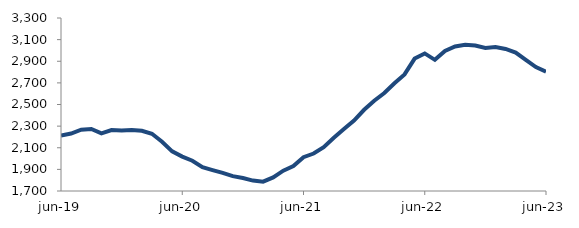
| Category | Series 0 |
|---|---|
| 2019-06-01 | 2213.708 |
| 2019-07-01 | 2231.834 |
| 2019-08-01 | 2267.321 |
| 2019-09-01 | 2273.768 |
| 2019-10-01 | 2233.304 |
| 2019-11-01 | 2263.898 |
| 2019-12-01 | 2259.926 |
| 2020-01-01 | 2265.053 |
| 2020-02-01 | 2256.766 |
| 2020-03-01 | 2229.161 |
| 2020-04-01 | 2155.791 |
| 2020-05-01 | 2066.843 |
| 2020-06-01 | 2018.026 |
| 2020-07-01 | 1979.558 |
| 2020-08-01 | 1920.368 |
| 2020-09-01 | 1893.237 |
| 2020-10-01 | 1867.4 |
| 2020-11-01 | 1837.195 |
| 2020-12-01 | 1819.546 |
| 2021-01-01 | 1796.45 |
| 2021-02-01 | 1786.603 |
| 2021-03-01 | 1826.072 |
| 2021-04-01 | 1887.798 |
| 2021-05-01 | 1930.372 |
| 2021-06-01 | 2012.926 |
| 2021-07-01 | 2046.434 |
| 2021-08-01 | 2105.806 |
| 2021-09-01 | 2192.514 |
| 2021-10-01 | 2272.972 |
| 2021-11-01 | 2351.334 |
| 2021-12-01 | 2451.171 |
| 2022-01-01 | 2534.613 |
| 2022-02-01 | 2606.357 |
| 2022-03-01 | 2696.948 |
| 2022-04-01 | 2778.264 |
| 2022-05-01 | 2924.682 |
| 2022-06-01 | 2972.281 |
| 2022-07-01 | 2912.933 |
| 2022-08-01 | 2994.913 |
| 2022-09-01 | 3036.467 |
| 2022-10-01 | 3052.236 |
| 2022-11-01 | 3044.767 |
| 2022-12-01 | 3023.141 |
| 2023-01-01 | 3030.956 |
| 2023-02-01 | 3013.674 |
| 2023-03-01 | 2979.861 |
| 2023-04-01 | 2913.014 |
| 2023-05-01 | 2845.832 |
| 2023-06-01 | 2803.594 |